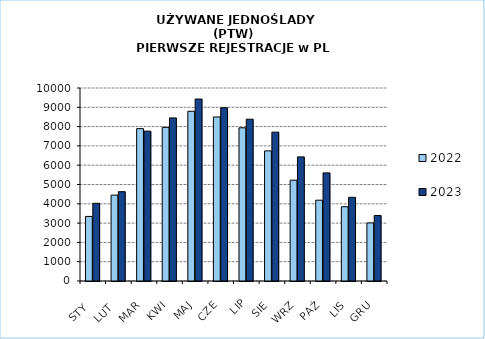
| Category | 2022 | 2023 |
|---|---|---|
|  STY  | 3346 | 4026 |
|  LUT  | 4450 | 4628 |
| MAR | 7895 | 7765 |
| KWI | 7963 | 8450 |
| MAJ | 8794 | 9428 |
| CZE | 8500 | 8977 |
| LIP | 7938 | 8384 |
| SIE | 6742 | 7712 |
| WRZ | 5223 | 6430 |
| PAŹ | 4186 | 5601 |
| LIS | 3848 | 4336 |
| GRU | 3010 | 3393 |